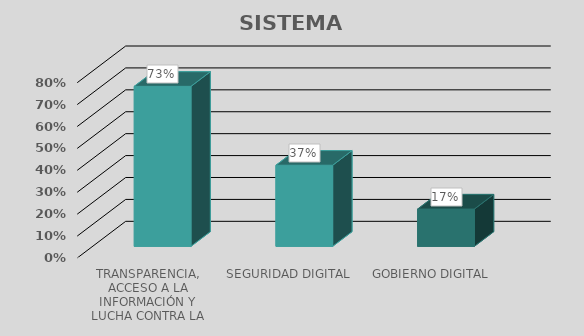
| Category | Series 0 |
|---|---|
| TRANSPARENCIA, ACCESO A LA INFORMACIÓN Y LUCHA CONTRA LA CORRUPCIÓN  | 0.73 |
| SEGURIDAD DIGITAL | 0.37 |
| GOBIERNO DIGITAL | 0.17 |